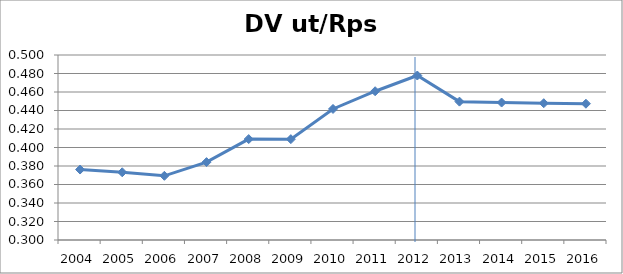
| Category | DV ut/Rps ut |
|---|---|
| 2004.0 | 0.376 |
| 2005.0 | 0.373 |
| 2006.0 | 0.369 |
| 2007.0 | 0.384 |
| 2008.0 | 0.409 |
| 2009.0 | 0.409 |
| 2010.0 | 0.442 |
| 2011.0 | 0.461 |
| 2012.0 | 0.478 |
| 2013.0 | 0.45 |
| 2014.0 | 0.449 |
| 2015.0 | 0.448 |
| 2016.0 | 0.447 |